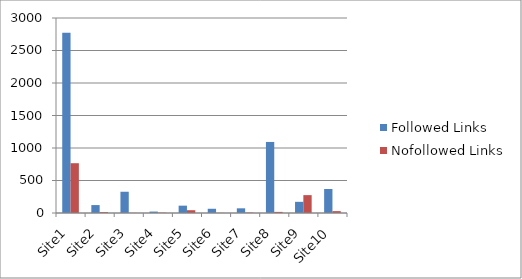
| Category | Followed Links | Nofollowed Links |
|---|---|---|
| Site1 | 2773 | 766 |
| Site2 | 122 | 14 |
| Site3 | 327 | 2 |
| Site4 | 22 | 5 |
| Site5 | 113 | 43 |
| Site6 | 65 | 2 |
| Site7 | 72 | 6 |
| Site8 | 1093 | 17 |
| Site9 | 172 | 275 |
| Site10 | 369 | 29 |